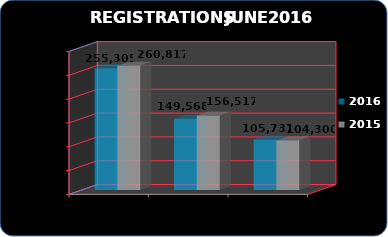
| Category | 2016 | 2015 |
|---|---|---|
| Total Registrations | 255305 | 260817 |
| No-Residentes | 149568 | 156517 |
| Residentes | 105737 | 104300 |